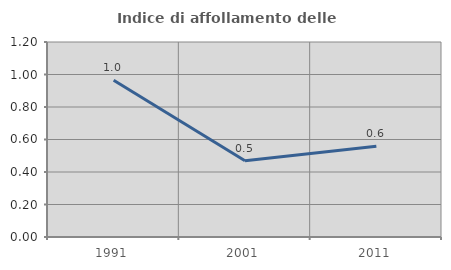
| Category | Indice di affollamento delle abitazioni  |
|---|---|
| 1991.0 | 0.965 |
| 2001.0 | 0.47 |
| 2011.0 | 0.558 |